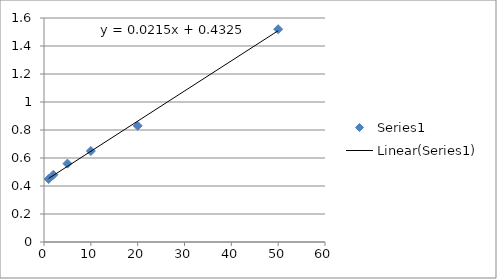
| Category | Series 0 |
|---|---|
| 1.0 | 0.45 |
| 2.0 | 0.48 |
| 5.0 | 0.56 |
| 10.0 | 0.65 |
| 20.0 | 0.83 |
| 50.0 | 1.52 |